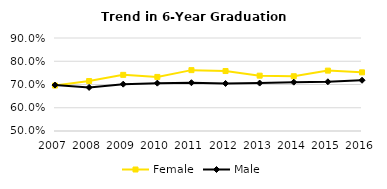
| Category | Female | Male |
|---|---|---|
| 2007.0 | 0.696 | 0.698 |
| 2008.0 | 0.715 | 0.687 |
| 2009.0 | 0.742 | 0.701 |
| 2010.0 | 0.733 | 0.706 |
| 2011.0 | 0.762 | 0.708 |
| 2012.0 | 0.758 | 0.704 |
| 2013.0 | 0.738 | 0.706 |
| 2014.0 | 0.736 | 0.71 |
| 2015.0 | 0.76 | 0.712 |
| 2016.0 | 0.752 | 0.718 |